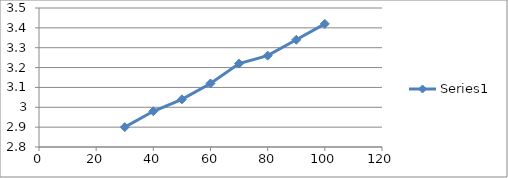
| Category | Series 0 |
|---|---|
| 100.0 | 3.42 |
| 90.0 | 3.34 |
| 80.0 | 3.26 |
| 70.0 | 3.22 |
| 60.0 | 3.12 |
| 50.0 | 3.04 |
| 40.0 | 2.98 |
| 30.0 | 2.9 |